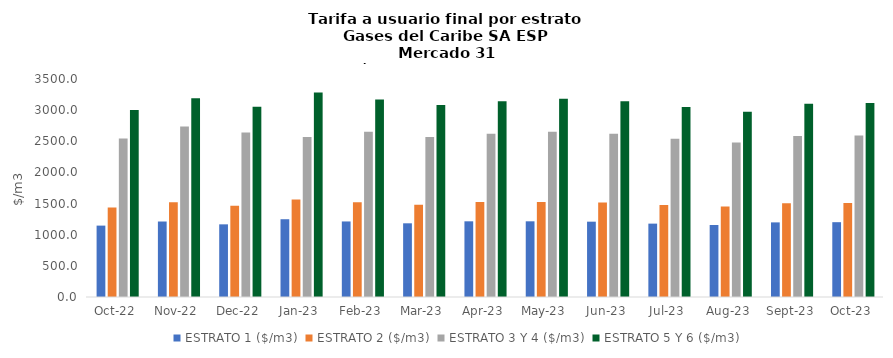
| Category | ESTRATO 1 ($/m3) | ESTRATO 2 ($/m3) | ESTRATO 3 Y 4 ($/m3) | ESTRATO 5 Y 6 ($/m3) |
|---|---|---|---|---|
| 2022-10-01 | 1146.18 | 1437.12 | 2544.24 | 3004.248 |
| 2022-11-01 | 1212.06 | 1519.44 | 2736.03 | 3189.972 |
| 2022-12-01 | 1166.58 | 1463.43 | 2641.83 | 3053.088 |
| 2023-01-01 | 1248.7 | 1565.89 | 2568.94 | 3283.236 |
| 2023-02-01 | 1212.89 | 1521.57 | 2651.33 | 3170.196 |
| 2023-03-01 | 1183.19 | 1482.78 | 2568.94 | 3082.728 |
| 2023-04-01 | 1215.25 | 1524.46 | 2619.03 | 3142.836 |
| 2023-05-01 | 1215.25 | 1524.46 | 2651.33 | 3181.596 |
| 2023-06-01 | 1209.41 | 1517.12 | 2619.03 | 3142.836 |
| 2023-07-01 | 1178 | 1477.97 | 2542.18 | 3050.616 |
| 2023-08-01 | 1155.93 | 1451.92 | 2479.28 | 2975.136 |
| 2023-09-01 | 1198 | 1503.27 | 2586.8 | 3104.16 |
| 2023-10-01 | 1201.13 | 1507.69 | 2594.42 | 3113.304 |